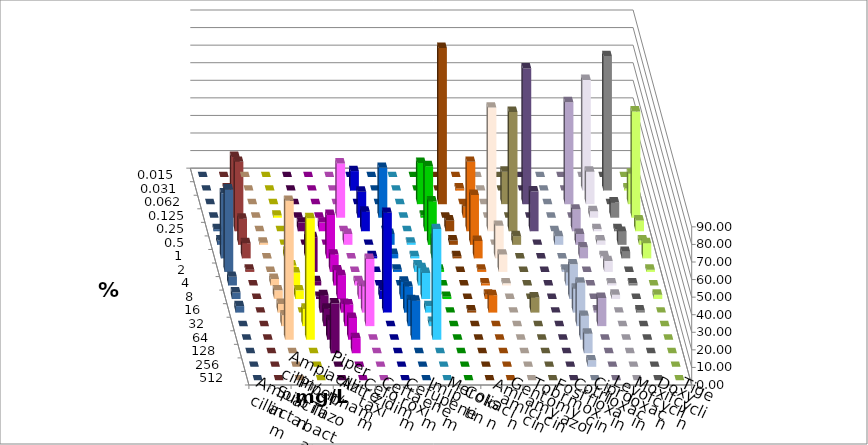
| Category | Ampicillin | Ampicillin/ Sulbactam | Piperacillin | Piperacillin/ Tazobactam | Aztreonam | Cefotaxim | Ceftazidim | Cefuroxim | Imipenem | Meropenem | Colistin | Amikacin | Gentamicin | Tobramycin | Fosfomycin | Cotrimoxazol | Ciprofloxacin | Levofloxacin | Moxifloxacin | Doxycyclin | Tigecyclin |
|---|---|---|---|---|---|---|---|---|---|---|---|---|---|---|---|---|---|---|---|---|---|
| 0.015 | 0 | 0 | 0 | 0 | 0 | 0 | 0 | 0 | 0 | 0 | 0 | 0 | 0 | 0 | 0 | 0 | 0 | 0 | 0 | 0 | 0 |
| 0.031 | 0 | 0 | 0 | 0 | 0 | 11.111 | 0 | 0 | 0 | 0 | 1.235 | 0 | 0 | 0 | 0 | 0 | 62.963 | 76.543 | 1.235 | 0 | 1.235 |
| 0.062 | 0 | 0 | 0 | 0 | 0 | 0 | 0 | 0 | 23.457 | 88.889 | 0 | 0 | 18.519 | 77.273 | 0 | 58.025 | 18.519 | 0 | 17.284 | 0 | 0 |
| 0.125 | 0 | 1.235 | 0 | 0 | 30.864 | 14.815 | 28.395 | 0 | 1.235 | 0 | 6.173 | 0 | 0 | 0 | 0 | 0 | 3.704 | 8.642 | 60.494 | 0 | 34.568 |
| 0.25 | 0 | 0 | 4.938 | 4.938 | 0 | 11.111 | 0 | 0 | 37.037 | 6.173 | 39.506 | 70.37 | 67.901 | 22.727 | 0 | 12.346 | 1.235 | 1.235 | 6.173 | 1.235 | 39.506 |
| 0.5 | 1.235 | 0 | 0 | 0 | 6.173 | 0 | 6.173 | 1.235 | 24.691 | 2.469 | 28.395 | 0 | 4.938 | 0 | 4.938 | 6.173 | 2.469 | 7.407 | 2.469 | 2.469 | 14.815 |
| 1.0 | 0 | 3.704 | 12.346 | 24.691 | 0 | 1.235 | 2.469 | 1.235 | 11.111 | 1.235 | 9.877 | 18.519 | 0 | 0 | 0 | 6.173 | 1.235 | 3.704 | 8.642 | 37.037 | 8.642 |
| 2.0 | 0 | 3.704 | 19.753 | 9.877 | 0 | 0 | 1.235 | 3.704 | 1.235 | 0 | 1.235 | 9.877 | 0 | 0 | 1.235 | 0 | 6.173 | 0 | 1.235 | 46.914 | 1.235 |
| 4.0 | 3.704 | 7.407 | 2.469 | 8.642 | 2.469 | 0 | 0 | 9.877 | 0 | 0 | 1.235 | 1.235 | 0 | 0 | 7.407 | 0 | 1.235 | 1.235 | 0 | 4.938 | 0 |
| 8.0 | 4.938 | 4.938 | 1.235 | 13.58 | 7.407 | 4.938 | 9.877 | 14.815 | 1.235 | 0 | 2.469 | 0 | 0 | 0 | 19.753 | 0 | 2.469 | 0 | 2.469 | 3.704 | 0 |
| 16.0 | 4.938 | 0 | 9.877 | 4.938 | 14.815 | 56.79 | 14.815 | 3.704 | 0 | 1.235 | 9.877 | 0 | 8.642 | 0 | 13.58 | 1.235 | 0 | 1.235 | 0 | 3.704 | 0 |
| 32.0 | 6.173 | 9.877 | 9.877 | 12.346 | 38.272 | 0 | 14.815 | 2.469 | 0 | 0 | 0 | 0 | 0 | 0 | 24.691 | 16.049 | 0 | 0 | 0 | 0 | 0 |
| 64.0 | 79.012 | 69.136 | 11.111 | 12.346 | 0 | 0 | 22.222 | 62.963 | 0 | 0 | 0 | 0 | 0 | 0 | 13.58 | 0 | 0 | 0 | 0 | 0 | 0 |
| 128.0 | 0 | 0 | 28.395 | 8.642 | 0 | 0 | 0 | 0 | 0 | 0 | 0 | 0 | 0 | 0 | 11.111 | 0 | 0 | 0 | 0 | 0 | 0 |
| 256.0 | 0 | 0 | 0 | 0 | 0 | 0 | 0 | 0 | 0 | 0 | 0 | 0 | 0 | 0 | 3.704 | 0 | 0 | 0 | 0 | 0 | 0 |
| 512.0 | 0 | 0 | 0 | 0 | 0 | 0 | 0 | 0 | 0 | 0 | 0 | 0 | 0 | 0 | 0 | 0 | 0 | 0 | 0 | 0 | 0 |